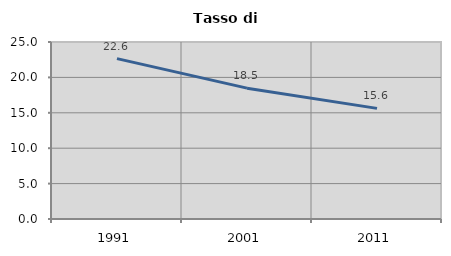
| Category | Tasso di disoccupazione   |
|---|---|
| 1991.0 | 22.649 |
| 2001.0 | 18.482 |
| 2011.0 | 15.625 |